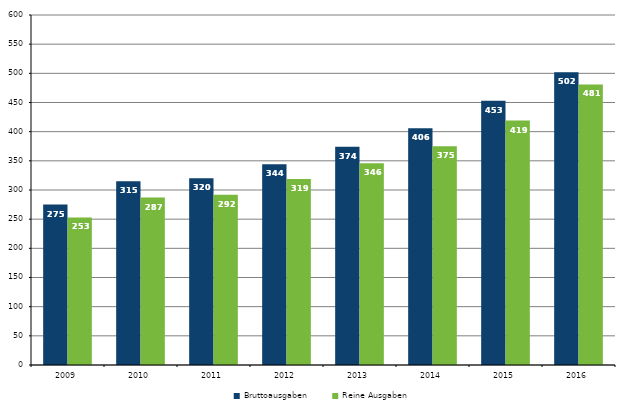
| Category | Bruttoausgaben | Reine Ausgaben |
|---|---|---|
| 2009.0 | 275 | 253 |
| 2010.0 | 315 | 287 |
| 2011.0 | 320 | 292 |
| 2012.0 | 344 | 319 |
| 2013.0 | 374 | 346 |
| 2014.0 | 406 | 375 |
| 2015.0 | 453 | 419 |
| 2016.0 | 502 | 481 |